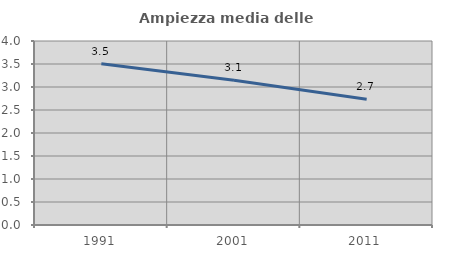
| Category | Ampiezza media delle famiglie |
|---|---|
| 1991.0 | 3.507 |
| 2001.0 | 3.149 |
| 2011.0 | 2.732 |